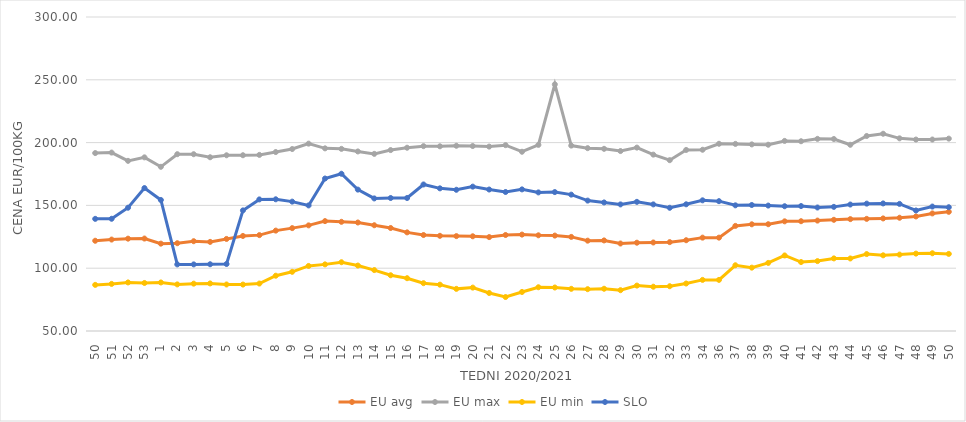
| Category | EU avg | EU max | EU min | SLO |
|---|---|---|---|---|
| 50.0 | 121.851 | 191.67 | 86.72 | 139.29 |
| 51.0 | 122.8 | 192.06 | 87.5 | 139.35 |
| 52.0 | 123.52 | 185.468 | 88.67 | 148.16 |
| 53.0 | 123.611 | 188.25 | 88.23 | 163.81 |
| 1.0 | 119.553 | 180.72 | 88.64 | 154.31 |
| 2.0 | 119.893 | 190.77 | 87.1 | 103.02 |
| 3.0 | 121.489 | 190.76 | 87.7 | 103.03 |
| 4.0 | 120.954 | 188.33 | 87.88 | 103.15 |
| 5.0 | 123.293 | 189.91 | 87.04 | 103.34 |
| 6.0 | 125.679 | 189.94 | 86.97 | 146.03 |
| 7.0 | 126.33 | 190.21 | 87.79 | 154.77 |
| 8.0 | 129.933 | 192.48 | 94.02 | 154.86 |
| 9.0 | 131.908 | 194.884 | 97.12 | 153 |
| 10.0 | 134.098 | 199.17 | 101.79 | 149.98 |
| 11.0 | 137.49 | 195.419 | 103.05 | 171.4 |
| 12.0 | 136.929 | 195.013 | 104.76 | 175.2 |
| 13.0 | 136.39 | 192.952 | 102.11 | 162.57 |
| 14.0 | 134.198 | 191.034 | 98.5 | 155.55 |
| 15.0 | 132.003 | 194.047 | 94.39 | 155.88 |
| 16.0 | 128.53 | 195.913 | 92.04 | 155.88 |
| 17.0 | 126.415 | 197.188 | 88.07 | 166.66 |
| 18.0 | 125.787 | 197.055 | 86.89 | 163.58 |
| 19.0 | 125.54 | 197.478 | 83.546 | 162.44 |
| 20.0 | 125.412 | 197.263 | 84.55 | 164.94 |
| 21.0 | 124.768 | 196.821 | 80.264 | 162.64 |
| 22.0 | 126.43 | 197.963 | 77.048 | 160.68 |
| 23.0 | 126.76 | 192.72 | 81.087 | 162.75 |
| 24.0 | 126.19 | 198.186 | 84.83 | 160.34 |
| 25.0 | 125.97 | 246.36 | 84.63 | 160.6 |
| 26.0 | 124.92 | 197.607 | 83.57 | 158.57 |
| 27.0 | 121.922 | 195.566 | 83.3 | 153.83 |
| 28.0 | 122.106 | 195.043 | 83.64 | 152.35 |
| 29.0 | 119.659 | 193.272 | 82.49 | 150.79 |
| 30.0 | 120.3 | 196.01 | 86.16 | 152.82 |
| 31.0 | 120.473 | 190.42 | 85.26 | 150.8 |
| 32.0 | 120.756 | 186 | 85.65 | 148.1 |
| 33.0 | 122.274 | 194.145 | 87.8 | 150.88 |
| 34.0 | 124.332 | 194.304 | 90.69 | 154.04 |
| 36.0 | 124.332 | 199.06 | 90.69 | 153.37 |
| 37.0 | 133.685 | 198.97 | 102.334 | 150.06 |
| 38.0 | 134.959 | 198.57 | 100.43 | 150.32 |
| 39.0 | 135.021 | 198.3 | 104.21 | 149.86 |
| 40.0 | 137.315 | 201.34 | 110.15 | 149.34 |
| 41.0 | 137.411 | 201.081 | 104.9 | 149.48 |
| 42.0 | 137.908 | 202.98 | 105.65 | 148.32 |
| 43.0 | 138.52 | 202.856 | 107.8 | 148.83 |
| 44.0 | 139.076 | 198.26 | 107.75 | 150.69 |
| 45.0 | 139.275 | 205.257 | 111.25 | 151.41 |
| 46.0 | 139.626 | 207.046 | 110.26 | 151.56 |
| 47.0 | 140.17 | 203.387 | 110.83 | 151.2 |
| 48.0 | 141.2 | 202.42 | 111.62 | 145.97 |
| 49.0 | 143.614 | 202.45 | 111.89 | 149.07 |
| 50.0 | 144.894 | 203.17 | 111.39 | 148.55 |